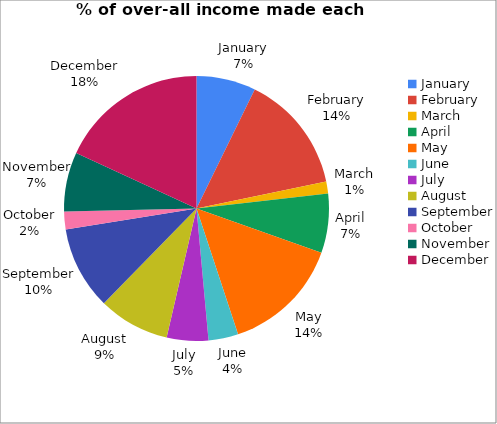
| Category | 2019 | Series1 |
|---|---|---|
| January | 1000 | 500 |
| February | 2000 | 0 |
| March | 200 | 500 |
| April | 1000 | 500 |
| May | 2000 | 0 |
| June | 500 | 500 |
| July | 700 | 500 |
| August | 1200 | 500 |
| September | 1400 | 500 |
| October | 300 | 500 |
| November | 1000 | 500 |
| December | 2500 | 500 |